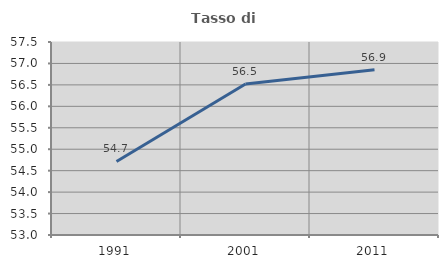
| Category | Tasso di occupazione   |
|---|---|
| 1991.0 | 54.714 |
| 2001.0 | 56.522 |
| 2011.0 | 56.852 |